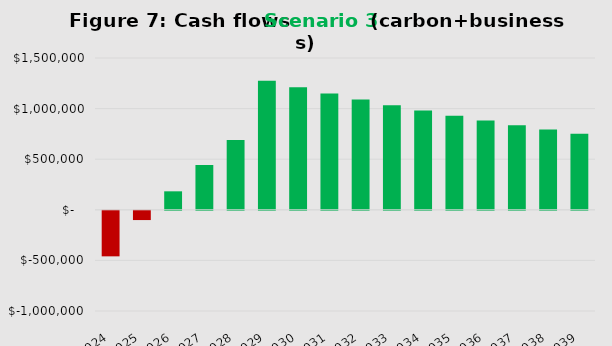
| Category | Series 0 |
|---|---|
| 2024.0 | -450000 |
| 2025.0 | -91500 |
| 2026.0 | 182575 |
| 2027.0 | 442946.25 |
| 2028.0 | 690298.938 |
| 2029.0 | 1275283.991 |
| 2030.0 | 1210019.791 |
| 2031.0 | 1148018.802 |
| 2032.0 | 1089117.861 |
| 2033.0 | 1033161.968 |
| 2034.0 | 980003.87 |
| 2035.0 | 929503.676 |
| 2036.0 | 881528.493 |
| 2037.0 | 835952.068 |
| 2038.0 | 792654.465 |
| 2039.0 | 751521.741 |